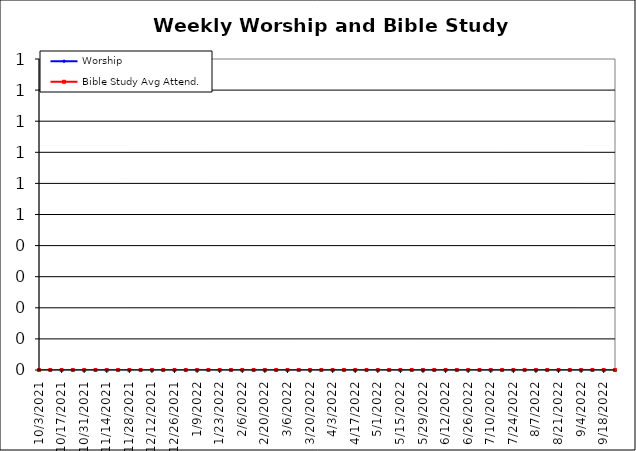
| Category | Worship | Bible Study Avg Attend. |
|---|---|---|
| 10/3/21 | 0 | 0 |
| 10/10/21 | 0 | 0 |
| 10/17/21 | 0 | 0 |
| 10/24/21 | 0 | 0 |
| 10/31/21 | 0 | 0 |
| 11/7/21 | 0 | 0 |
| 11/14/21 | 0 | 0 |
| 11/21/21 | 0 | 0 |
| 11/28/21 | 0 | 0 |
| 12/5/21 | 0 | 0 |
| 12/12/21 | 0 | 0 |
| 12/19/21 | 0 | 0 |
| 12/26/21 | 0 | 0 |
| 1/2/22 | 0 | 0 |
| 1/9/22 | 0 | 0 |
| 1/16/22 | 0 | 0 |
| 1/23/22 | 0 | 0 |
| 1/30/22 | 0 | 0 |
| 2/6/22 | 0 | 0 |
| 2/13/22 | 0 | 0 |
| 2/20/22 | 0 | 0 |
| 2/27/22 | 0 | 0 |
| 3/6/22 | 0 | 0 |
| 3/13/22 | 0 | 0 |
| 3/20/22 | 0 | 0 |
| 3/27/22 | 0 | 0 |
| 4/3/22 | 0 | 0 |
| 4/10/22 | 0 | 0 |
| 4/17/22 | 0 | 0 |
| 4/24/22 | 0 | 0 |
| 5/1/22 | 0 | 0 |
| 5/8/22 | 0 | 0 |
| 5/15/22 | 0 | 0 |
| 5/22/22 | 0 | 0 |
| 5/29/22 | 0 | 0 |
| 6/5/22 | 0 | 0 |
| 6/12/22 | 0 | 0 |
| 6/19/22 | 0 | 0 |
| 6/26/22 | 0 | 0 |
| 7/3/22 | 0 | 0 |
| 7/10/22 | 0 | 0 |
| 7/17/22 | 0 | 0 |
| 7/24/22 | 0 | 0 |
| 7/31/22 | 0 | 0 |
| 8/7/22 | 0 | 0 |
| 8/14/22 | 0 | 0 |
| 8/21/22 | 0 | 0 |
| 8/28/22 | 0 | 0 |
| 9/4/22 | 0 | 0 |
| 9/11/22 | 0 | 0 |
| 9/18/22 | 0 | 0 |
| 9/25/22 | 0 | 0 |